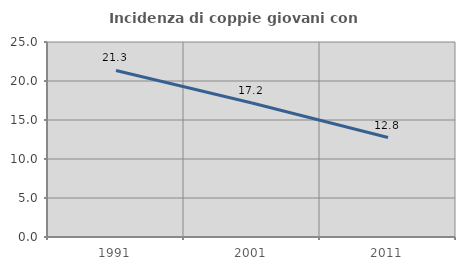
| Category | Incidenza di coppie giovani con figli |
|---|---|
| 1991.0 | 21.347 |
| 2001.0 | 17.18 |
| 2011.0 | 12.755 |